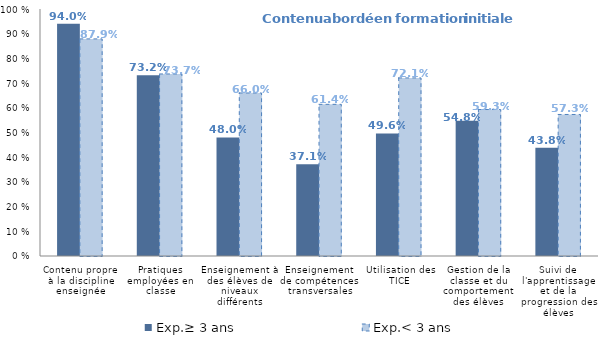
| Category | Exp.≥ 3 ans | Exp.< 3 ans |
|---|---|---|
| Contenu propre à la discipline enseignée | 0.94 | 0.879 |
| Pratiques employées en classe | 0.732 | 0.737 |
| Enseignement à des élèves de niveaux différents | 0.48 | 0.66 |
| Enseignement de compétences transversales | 0.371 | 0.614 |
| Utilisation des TICE | 0.496 | 0.721 |
| Gestion de la classe et du comportement des élèves | 0.548 | 0.593 |
| Suivi de l'apprentissage et de la progression des élèves | 0.438 | 0.573 |